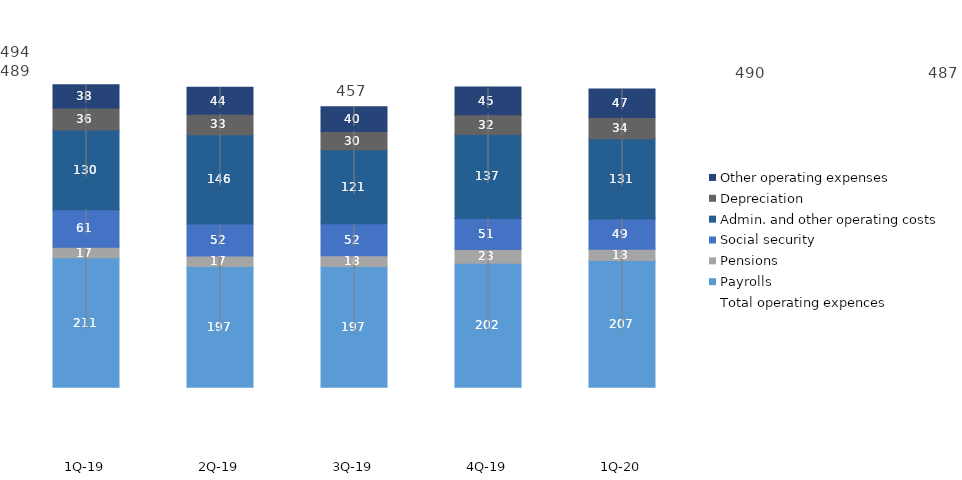
| Category | Payrolls | Pensions | Social security | Admin. and other operating costs | Depreciation | Other operating expenses |
|---|---|---|---|---|---|---|
| 1Q-20 | 206.729 | 18.337 | 49.424 | 130.978 | 34.5 | 46.562 |
| 4Q-19 | 202.122 | 22.717 | 50.527 | 137.063 | 32.223 | 45.052 |
| 3Q-19 | 197.115 | 17.531 | 51.896 | 120.883 | 29.827 | 40.201 |
| 2Q-19 | 196.87 | 17.26 | 52.39 | 145.58 | 33.35 | 43.87 |
| 1Q-19 | 211.174 | 17.185 | 61.24 | 130.252 | 35.543 | 38.331 |